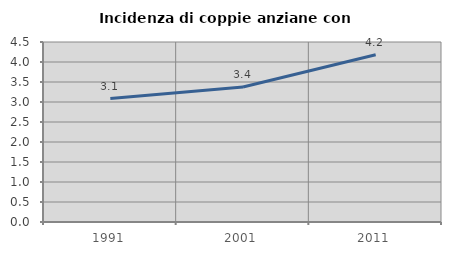
| Category | Incidenza di coppie anziane con figli |
|---|---|
| 1991.0 | 3.086 |
| 2001.0 | 3.375 |
| 2011.0 | 4.179 |